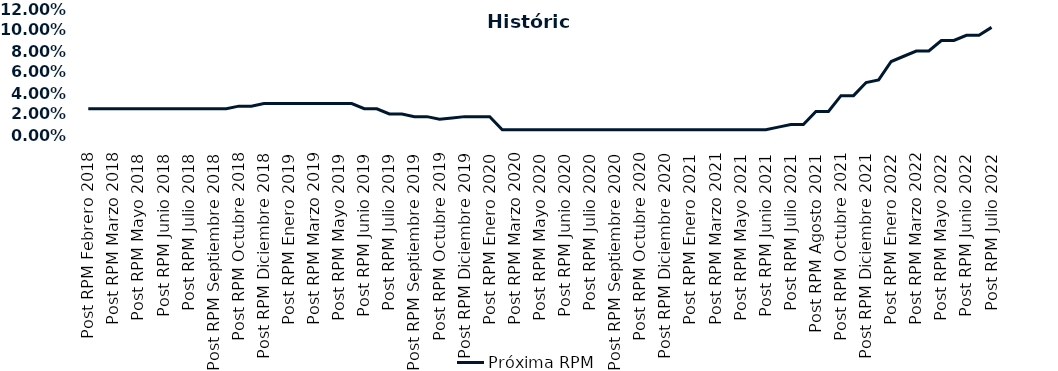
| Category | Próxima RPM |
|---|---|
| Post RPM Febrero 2018 | 0.025 |
| Pre RPM Marzo 2018 | 0.025 |
| Post RPM Marzo 2018 | 0.025 |
| Pre RPM Mayo 2018 | 0.025 |
| Post RPM Mayo 2018 | 0.025 |
| Pre RPM Junio 2018 | 0.025 |
| Post RPM Junio 2018 | 0.025 |
| Pre RPM Julio 2018 | 0.025 |
| Post RPM Julio 2018 | 0.025 |
| Pre RPM Septiembre 2018 | 0.025 |
| Post RPM Septiembre 2018 | 0.025 |
| Pre RPM Octubre 2018 | 0.025 |
| Post RPM Octubre 2018 | 0.028 |
| Pre RPM Diciembre 2018 | 0.028 |
| Post RPM Diciembre 2018 | 0.03 |
| Pre RPM Enero 2019 | 0.03 |
| Post RPM Enero 2019 | 0.03 |
| Pre RPM Marzo 2019 | 0.03 |
| Post RPM Marzo 2019 | 0.03 |
| Pre RPM Mayo 2019 | 0.03 |
| Post RPM Mayo 2019 | 0.03 |
| Pre RPM Junio 2019 | 0.03 |
| Post RPM Junio 2019 | 0.025 |
| Pre RPM Julio 2019 | 0.025 |
| Post RPM Julio 2019 | 0.02 |
| Pre RPM Septiembre 2019 | 0.02 |
| Post RPM Septiembre 2019 | 0.018 |
| Pre RPM Octubre 2019 | 0.018 |
| Post RPM Octubre 2019 | 0.015 |
| Pre RPM Diciembre 2019 | 0.016 |
| Post RPM Diciembre 2019 | 0.018 |
| Pre RPM Enero 2020 | 0.018 |
| Post RPM Enero 2020 | 0.018 |
| Pre RPM Marzo 2020 | 0.005 |
| Post RPM Marzo 2020 | 0.005 |
| Pre RPM Mayo 2020 | 0.005 |
| Post RPM Mayo 2020 | 0.005 |
| Pre RPM Junio 2020 | 0.005 |
| Post RPM Junio 2020 | 0.005 |
| Pre RPM Julio 2020 | 0.005 |
| Post RPM Julio 2020 | 0.005 |
| Pre RPM Septiembre 2020 | 0.005 |
| Post RPM Septiembre 2020 | 0.005 |
| Pre RPM Octubre 2020 | 0.005 |
| Post RPM Octubre 2020 | 0.005 |
| Pre RPM Diciembre 2020 | 0.005 |
| Post RPM Diciembre 2020 | 0.005 |
| Pre RPM Enero 2021 | 0.005 |
| Post RPM Enero 2021 | 0.005 |
| Pre RPM Marzo 2021 | 0.005 |
| Post RPM Marzo 2021 | 0.005 |
| Pre RPM Mayo 2021 | 0.005 |
| Post RPM Mayo 2021 | 0.005 |
| Pre RPM Junio 2021 | 0.005 |
| Post RPM Junio 2021 | 0.005 |
| Pre RPM Julio 2021 | 0.008 |
| Post RPM Julio 2021 | 0.01 |
| Pre RPM Agosto 2021 | 0.01 |
| Post RPM Agosto 2021 | 0.022 |
| Pre RPM Octubre 2021 | 0.022 |
| Post RPM Octubre 2021 | 0.038 |
| Pre RPM Diciembre 2021 | 0.038 |
| Post RPM Diciembre 2021 | 0.05 |
| Pre RPM Enero 2022 | 0.052 |
| Post RPM Enero 2022 | 0.07 |
| Pre RPM Marzo 2022 | 0.075 |
| Post RPM Marzo 2022 | 0.08 |
| Pre RPM Mayo 2022 | 0.08 |
| Post RPM Mayo 2022 | 0.09 |
| Pre RPM Junio 2022 | 0.09 |
| Post RPM Junio 2022 | 0.095 |
| Pre RPM Julio 2022 | 0.095 |
| Post RPM Julio 2022 | 0.102 |